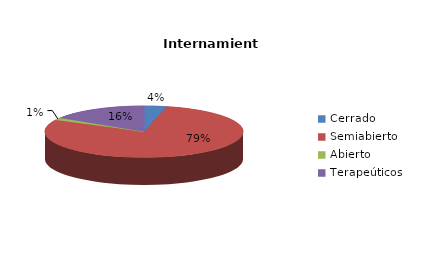
| Category | Series 0 |
|---|---|
| Cerrado | 5 |
| Semiabierto | 108 |
| Abierto | 2 |
| Terapeúticos | 22 |